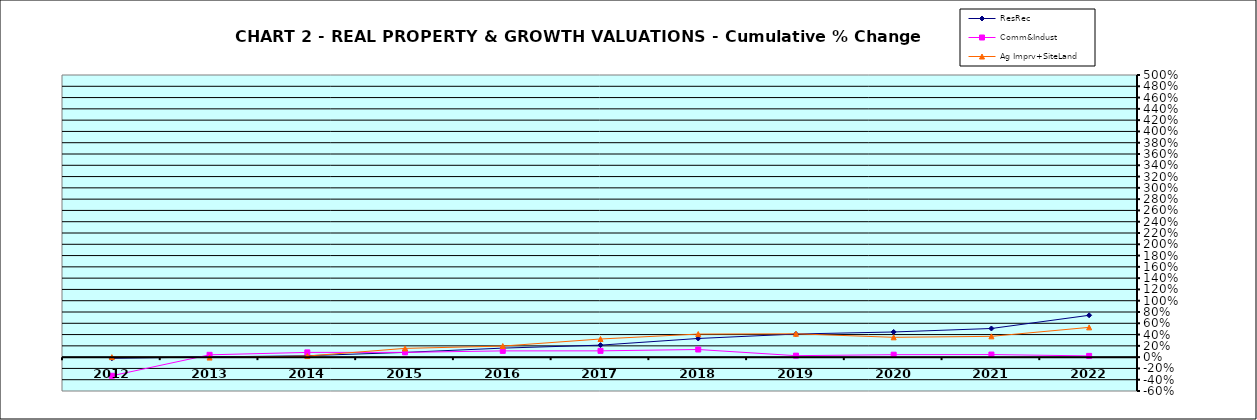
| Category | ResRec | Comm&Indust | Ag Imprv+SiteLand |
|---|---|---|---|
| 2012.0 | -0.02 | -0.33 | 0 |
| 2013.0 | 0.003 | 0.041 | -0.007 |
| 2014.0 | 0.025 | 0.084 | 0.019 |
| 2015.0 | 0.084 | 0.085 | 0.155 |
| 2016.0 | 0.16 | 0.111 | 0.196 |
| 2017.0 | 0.213 | 0.111 | 0.322 |
| 2018.0 | 0.331 | 0.135 | 0.409 |
| 2019.0 | 0.41 | 0.026 | 0.414 |
| 2020.0 | 0.446 | 0.044 | 0.351 |
| 2021.0 | 0.508 | 0.046 | 0.369 |
| 2022.0 | 0.742 | 0.022 | 0.528 |